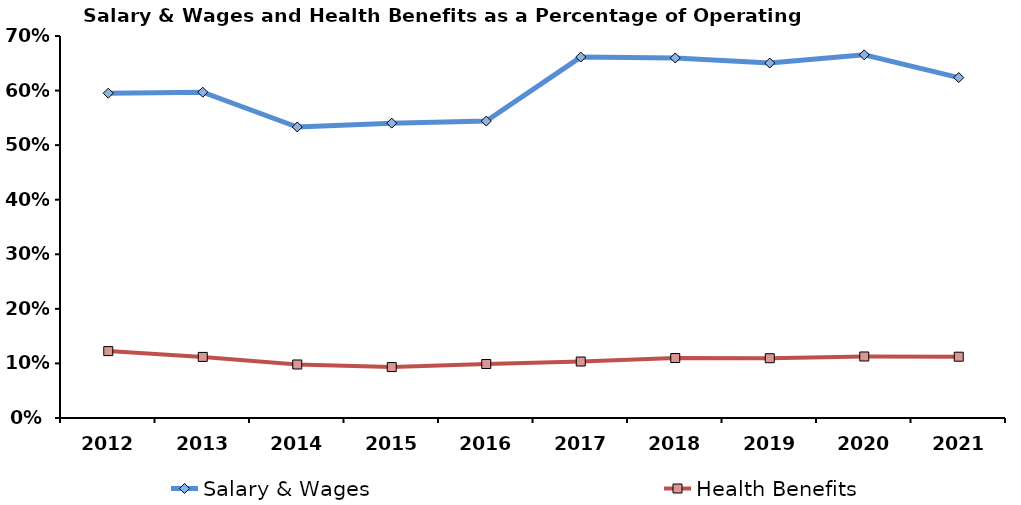
| Category | Salary & Wages | Health Benefits |
|---|---|---|
| 2012.0 | 0.595 | 0.123 |
| 2013.0 | 0.597 | 0.112 |
| 2014.0 | 0.533 | 0.098 |
| 2015.0 | 0.54 | 0.093 |
| 2016.0 | 0.544 | 0.099 |
| 2017.0 | 0.661 | 0.104 |
| 2018.0 | 0.66 | 0.11 |
| 2019.0 | 0.65 | 0.109 |
| 2020.0 | 0.665 | 0.113 |
| 2021.0 | 0.624 | 0.112 |